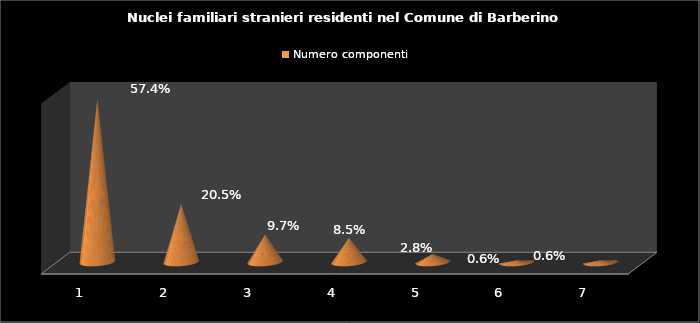
| Category | Numero componenti |
|---|---|
| 1.0 | 0.574 |
| 2.0 | 0.205 |
| 3.0 | 0.097 |
| 4.0 | 0.085 |
| 5.0 | 0.028 |
| 6.0 | 0.006 |
| 7.0 | 0.006 |